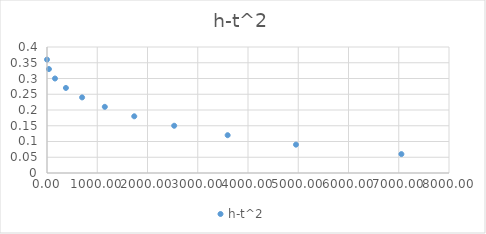
| Category | h-t^2 |
|---|---|
| 0.0 | 0.36 |
| 37.9456 | 0.33 |
| 159.26439999999997 | 0.3 |
| 376.35999999999996 | 0.27 |
| 698.5449 | 0.24 |
| 1150.5664000000002 | 0.21 |
| 1736.3889000000001 | 0.18 |
| 2531.0961 | 0.15 |
| 3595.2016000000003 | 0.12 |
| 4954.7521 | 0.09 |
| 7052.6404 | 0.06 |